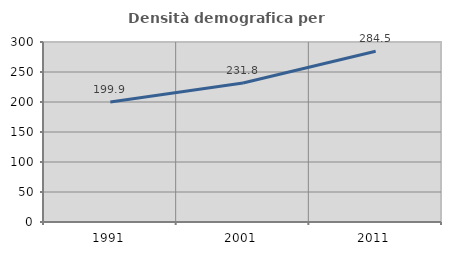
| Category | Densità demografica |
|---|---|
| 1991.0 | 199.883 |
| 2001.0 | 231.79 |
| 2011.0 | 284.52 |